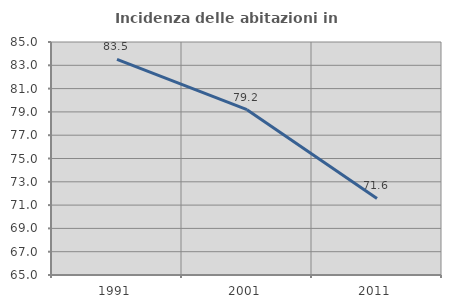
| Category | Incidenza delle abitazioni in proprietà  |
|---|---|
| 1991.0 | 83.509 |
| 2001.0 | 79.193 |
| 2011.0 | 71.572 |